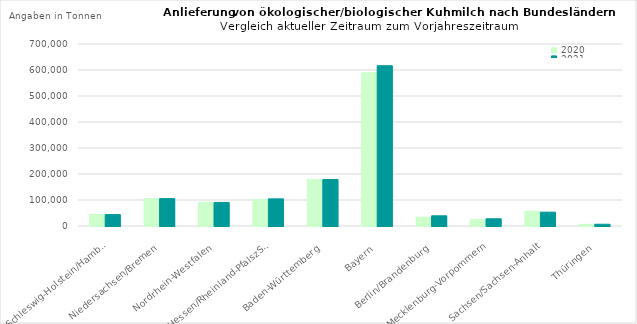
| Category | 2020 | 2021 |
|---|---|---|
| Schleswig-Holstein/Hamburg | 44163.811 | 43952.835 |
| Niedersachsen/Bremen | 105780.442 | 105277.624 |
| Nordrhein-Westfalen | 91486.358 | 90517.903 |
| Hessen/Rheinland-PfalszSaarland | 102387.031 | 104417.696 |
| Baden-Württemberg | 178341.934 | 178619.533 |
| Bayern | 588980.925 | 616545.231 |
| Berlin/Brandenburg | 34041.015 | 39215.754 |
| Mecklenburg-Vorpommern | 25689.245 | 27758.233 |
| Sachsen/Sachsen-Anhalt | 56985.444 | 53242.127 |
| Thüringen | 6381.486 | 6672.151 |